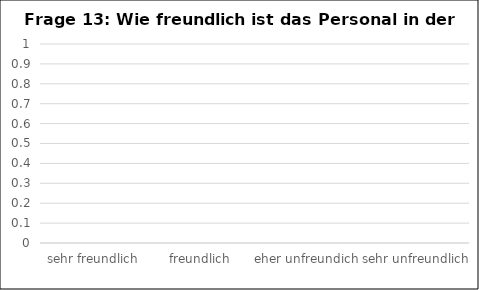
| Category | Series 0 |
|---|---|
| sehr freundlich | 0 |
| freundlich | 0 |
| eher unfreundich | 0 |
| sehr unfreundlich | 0 |